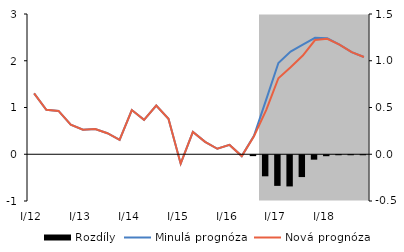
| Category | Rozdíly |
|---|---|
| 0 | 0 |
| 1 | 0 |
| 2 | 0 |
| 3 | 0 |
| 4 | 0 |
| 5 | 0 |
| 6 | 0 |
| 7 | 0 |
| 8 | 0 |
| 9 | 0 |
| 10 | 0 |
| 11 | 0 |
| 12 | 0 |
| 13 | 0 |
| 14 | 0 |
| 15 | 0 |
| 16 | 0 |
| 17 | 0 |
| 18 | -0.009 |
| 19 | -0.225 |
| 20 | -0.328 |
| 21 | -0.333 |
| 22 | -0.233 |
| 23 | -0.047 |
| 24 | -0.01 |
| 25 | 0.002 |
| 26 | 0.001 |
| 27 | 0.001 |